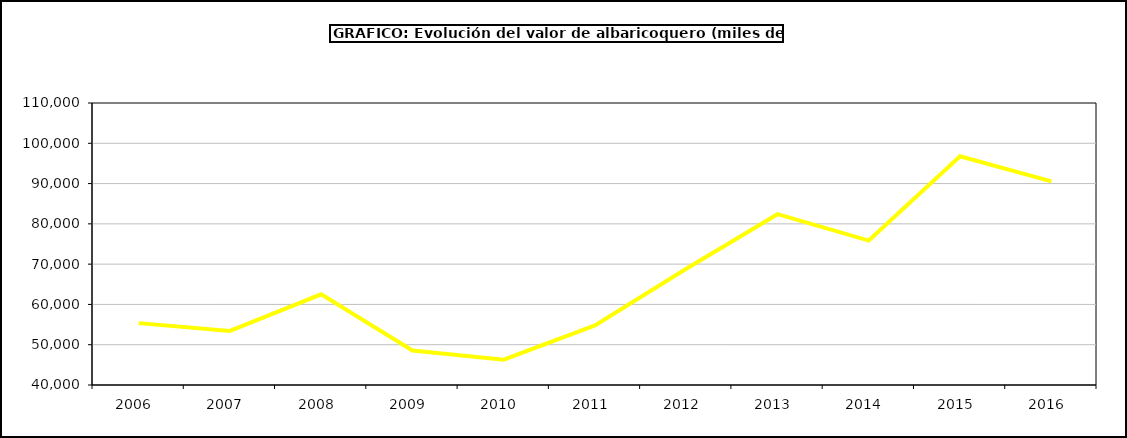
| Category | valor albaricoquero |
|---|---|
| 2006.0 | 55360.129 |
| 2007.0 | 53431.605 |
| 2008.0 | 62518.884 |
| 2009.0 | 48553.188 |
| 2010.0 | 46289.905 |
| 2011.0 | 54777.84 |
| 2012.0 | 68866.776 |
| 2013.0 | 82399.533 |
| 2014.0 | 75850.331 |
| 2015.0 | 96779 |
| 2016.0 | 90534 |